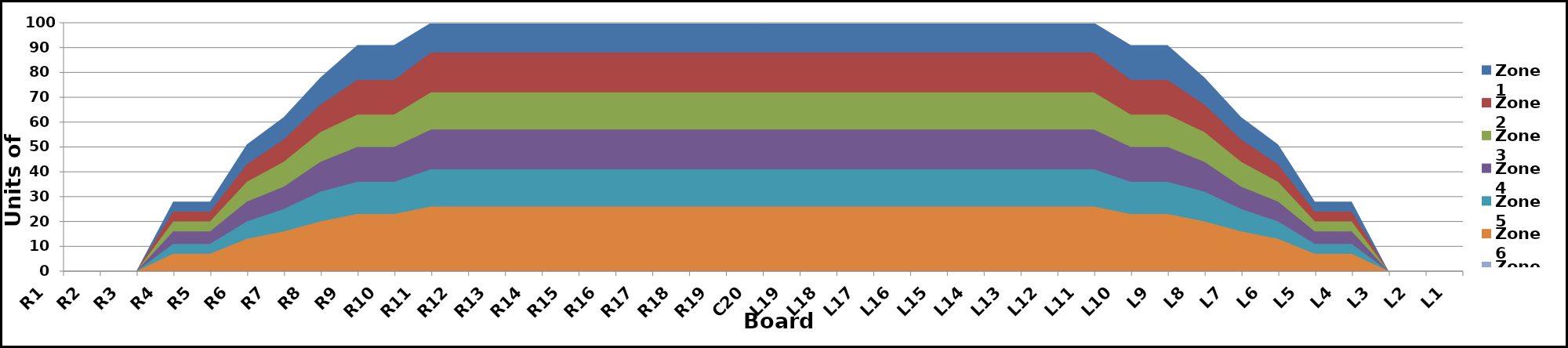
| Category | Zone 1 | Zone 2 | Zone 3 | Zone 4 | Zone 5 | Zone 6 | Zone 7 | Zone 8 |
|---|---|---|---|---|---|---|---|---|
| L1 | 0 | 0 | 0 | 0 | 0 | 0 | 0 | 0 |
| L2 | 0 | 0 | 0 | 0 | 0 | 0 | 0 | 0 |
| L3 | 0 | 0 | 0 | 0 | 0 | 0 | 0 | 0 |
| L4 | 28 | 24 | 20 | 16 | 11 | 7 | 0 | 0 |
| L5 | 28 | 24 | 20 | 16 | 11 | 7 | 0 | 0 |
| L6 | 51 | 43 | 36 | 28 | 20 | 13 | 0 | 0 |
| L7 | 62 | 53 | 44 | 34 | 25 | 16 | 0 | 0 |
| L8 | 78 | 67 | 56 | 44 | 32 | 20 | 0 | 0 |
| L9 | 91 | 77 | 63 | 50 | 36 | 23 | 0 | 0 |
| L10 | 91 | 77 | 63 | 50 | 36 | 23 | 0 | 0 |
| L11 | 100 | 88 | 72 | 57 | 41 | 26 | 0 | 0 |
| L12 | 100 | 88 | 72 | 57 | 41 | 26 | 0 | 0 |
| L13 | 100 | 88 | 72 | 57 | 41 | 26 | 0 | 0 |
| L14 | 100 | 88 | 72 | 57 | 41 | 26 | 0 | 0 |
| L15 | 100 | 88 | 72 | 57 | 41 | 26 | 0 | 0 |
| L16 | 100 | 88 | 72 | 57 | 41 | 26 | 0 | 0 |
| L17 | 100 | 88 | 72 | 57 | 41 | 26 | 0 | 0 |
| L18 | 100 | 88 | 72 | 57 | 41 | 26 | 0 | 0 |
| L19 | 100 | 88 | 72 | 57 | 41 | 26 | 0 | 0 |
| C20 | 100 | 88 | 72 | 57 | 41 | 26 | 0 | 0 |
| R19 | 100 | 88 | 72 | 57 | 41 | 26 | 0 | 0 |
| R18 | 100 | 88 | 72 | 57 | 41 | 26 | 0 | 0 |
| R17 | 100 | 88 | 72 | 57 | 41 | 26 | 0 | 0 |
| R16 | 100 | 88 | 72 | 57 | 41 | 26 | 0 | 0 |
| R15 | 100 | 88 | 72 | 57 | 41 | 26 | 0 | 0 |
| R14 | 100 | 88 | 72 | 57 | 41 | 26 | 0 | 0 |
| R13 | 100 | 88 | 72 | 57 | 41 | 26 | 0 | 0 |
| R12 | 100 | 88 | 72 | 57 | 41 | 26 | 0 | 0 |
| R11 | 100 | 88 | 72 | 57 | 41 | 26 | 0 | 0 |
| R10 | 91 | 77 | 63 | 50 | 36 | 23 | 0 | 0 |
| R9 | 91 | 77 | 63 | 50 | 36 | 23 | 0 | 0 |
| R8 | 78 | 67 | 56 | 44 | 32 | 20 | 0 | 0 |
| R7 | 62 | 53 | 44 | 34 | 25 | 16 | 0 | 0 |
| R6 | 51 | 43 | 36 | 28 | 20 | 13 | 0 | 0 |
| R5 | 28 | 24 | 20 | 16 | 11 | 7 | 0 | 0 |
| R4 | 28 | 24 | 20 | 16 | 11 | 7 | 0 | 0 |
| R3 | 0 | 0 | 0 | 0 | 0 | 0 | 0 | 0 |
| R2 | 0 | 0 | 0 | 0 | 0 | 0 | 0 | 0 |
| R1 | 0 | 0 | 0 | 0 | 0 | 0 | 0 | 0 |